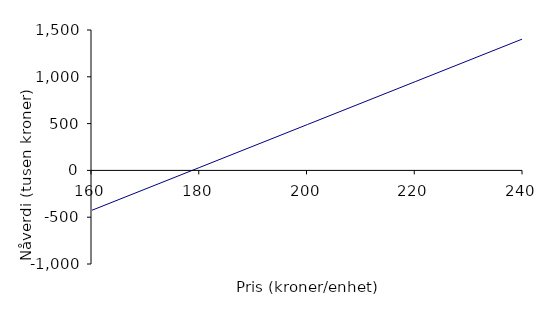
| Category | Series 0 |
|---|---|
| 160.0 | -425.653 |
| 180.0 | 32.318 |
| 200.0 | 490.289 |
| 220.0 | 948.259 |
| 240.0 | 1406.23 |